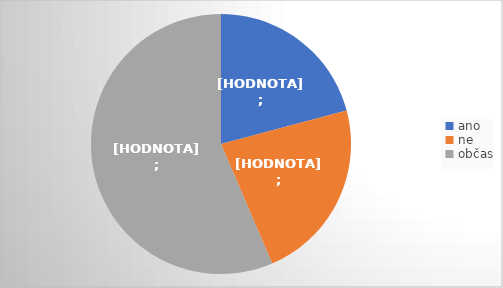
| Category | Series 0 |
|---|---|
| ano | 34 |
| ne | 37 |
| občas | 92 |